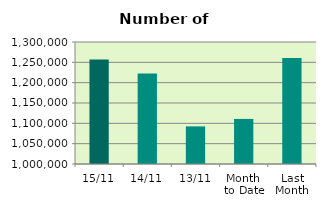
| Category | Series 0 |
|---|---|
| 15/11 | 1257140 |
| 14/11 | 1222532 |
| 13/11 | 1092452 |
| Month 
to Date | 1110839.091 |
| Last
Month | 1260789.391 |